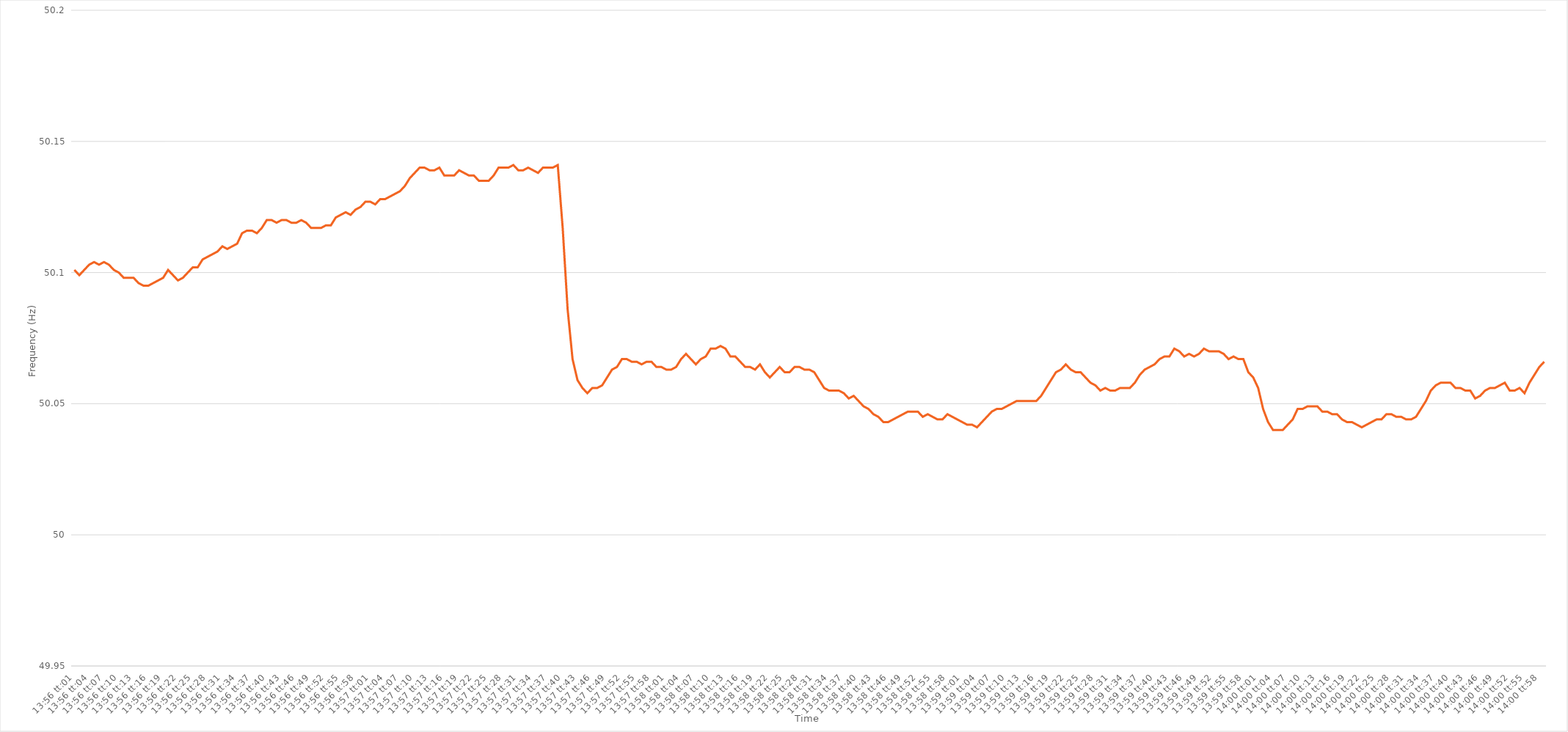
| Category | Series 0 |
|---|---|
| 0.5805671296296296 | 50.101 |
| 0.5805787037037037 | 50.099 |
| 0.5805902777777777 | 50.101 |
| 0.5806018518518519 | 50.103 |
| 0.5806134259259259 | 50.104 |
| 0.5806250000000001 | 50.103 |
| 0.5806365740740741 | 50.104 |
| 0.5806481481481481 | 50.103 |
| 0.5806597222222222 | 50.101 |
| 0.5806712962962963 | 50.1 |
| 0.5806828703703704 | 50.098 |
| 0.5806944444444445 | 50.098 |
| 0.5807060185185186 | 50.098 |
| 0.5807175925925926 | 50.096 |
| 0.5807291666666666 | 50.095 |
| 0.5807407407407407 | 50.095 |
| 0.5807523148148148 | 50.096 |
| 0.5807638888888889 | 50.097 |
| 0.580775462962963 | 50.098 |
| 0.580787037037037 | 50.101 |
| 0.5807986111111111 | 50.099 |
| 0.5808101851851851 | 50.097 |
| 0.5808217592592593 | 50.098 |
| 0.5808333333333333 | 50.1 |
| 0.5808449074074075 | 50.102 |
| 0.5808564814814815 | 50.102 |
| 0.5808680555555555 | 50.105 |
| 0.5808796296296296 | 50.106 |
| 0.5808912037037037 | 50.107 |
| 0.5809027777777778 | 50.108 |
| 0.5809143518518519 | 50.11 |
| 0.580925925925926 | 50.109 |
| 0.5809375 | 50.11 |
| 0.580949074074074 | 50.111 |
| 0.5809606481481482 | 50.115 |
| 0.5809722222222222 | 50.116 |
| 0.5809837962962963 | 50.116 |
| 0.5809953703703704 | 50.115 |
| 0.5810069444444445 | 50.117 |
| 0.5810185185185185 | 50.12 |
| 0.5810300925925925 | 50.12 |
| 0.5810416666666667 | 50.119 |
| 0.5810532407407407 | 50.12 |
| 0.5810648148148149 | 50.12 |
| 0.5810763888888889 | 50.119 |
| 0.581087962962963 | 50.119 |
| 0.581099537037037 | 50.12 |
| 0.5811111111111111 | 50.119 |
| 0.5811226851851852 | 50.117 |
| 0.5811342592592593 | 50.117 |
| 0.5811458333333334 | 50.117 |
| 0.5811574074074074 | 50.118 |
| 0.5811689814814814 | 50.118 |
| 0.5811805555555556 | 50.121 |
| 0.5811921296296296 | 50.122 |
| 0.5812037037037037 | 50.123 |
| 0.5812152777777778 | 50.122 |
| 0.5812268518518519 | 50.124 |
| 0.5812384259259259 | 50.125 |
| 0.5812499999999999 | 50.127 |
| 0.5812615740740741 | 50.127 |
| 0.5812731481481481 | 50.126 |
| 0.5812847222222223 | 50.128 |
| 0.5812962962962963 | 50.128 |
| 0.5813078703703703 | 50.129 |
| 0.5813194444444444 | 50.13 |
| 0.5813310185185185 | 50.131 |
| 0.5813425925925926 | 50.133 |
| 0.5813541666666667 | 50.136 |
| 0.5813657407407408 | 50.138 |
| 0.5813773148148148 | 50.14 |
| 0.5813888888888888 | 50.14 |
| 0.581400462962963 | 50.139 |
| 0.581412037037037 | 50.139 |
| 0.5814236111111112 | 50.14 |
| 0.5814351851851852 | 50.137 |
| 0.5814467592592593 | 50.137 |
| 0.5814583333333333 | 50.137 |
| 0.5814699074074073 | 50.139 |
| 0.5814814814814815 | 50.138 |
| 0.5814930555555555 | 50.137 |
| 0.5815046296296297 | 50.137 |
| 0.5815162037037037 | 50.135 |
| 0.5815277777777778 | 50.135 |
| 0.5815393518518518 | 50.135 |
| 0.5815509259259259 | 50.137 |
| 0.5815625 | 50.14 |
| 0.5815740740740741 | 50.14 |
| 0.5815856481481482 | 50.14 |
| 0.5815972222222222 | 50.141 |
| 0.5816087962962962 | 50.139 |
| 0.5816203703703704 | 50.139 |
| 0.5816319444444444 | 50.14 |
| 0.5816435185185186 | 50.139 |
| 0.5816550925925926 | 50.138 |
| 0.5816666666666667 | 50.14 |
| 0.5816782407407407 | 50.14 |
| 0.5816898148148147 | 50.14 |
| 0.5817013888888889 | 50.141 |
| 0.5817129629629629 | 50.117 |
| 0.5817245370370371 | 50.086 |
| 0.5817361111111111 | 50.067 |
| 0.5817476851851852 | 50.059 |
| 0.5817592592592592 | 50.056 |
| 0.5817708333333333 | 50.054 |
| 0.5817824074074074 | 50.056 |
| 0.5817939814814815 | 50.056 |
| 0.5818055555555556 | 50.057 |
| 0.5818171296296296 | 50.06 |
| 0.5818287037037037 | 50.063 |
| 0.5818402777777778 | 50.064 |
| 0.5818518518518518 | 50.067 |
| 0.581863425925926 | 50.067 |
| 0.581875 | 50.066 |
| 0.5818865740740741 | 50.066 |
| 0.5818981481481481 | 50.065 |
| 0.5819097222222223 | 50.066 |
| 0.5819212962962963 | 50.066 |
| 0.5819328703703703 | 50.064 |
| 0.5819444444444445 | 50.064 |
| 0.5819560185185185 | 50.063 |
| 0.5819675925925926 | 50.063 |
| 0.5819791666666666 | 50.064 |
| 0.5819907407407408 | 50.067 |
| 0.5820023148148148 | 50.069 |
| 0.5820138888888889 | 50.067 |
| 0.582025462962963 | 50.065 |
| 0.582037037037037 | 50.067 |
| 0.5820486111111111 | 50.068 |
| 0.5820601851851852 | 50.071 |
| 0.5820717592592592 | 50.071 |
| 0.5820833333333334 | 50.072 |
| 0.5820949074074074 | 50.071 |
| 0.5821064814814815 | 50.068 |
| 0.5821180555555555 | 50.068 |
| 0.5821296296296297 | 50.066 |
| 0.5821412037037037 | 50.064 |
| 0.5821527777777777 | 50.064 |
| 0.5821643518518519 | 50.063 |
| 0.5821759259259259 | 50.065 |
| 0.5821875 | 50.062 |
| 0.582199074074074 | 50.06 |
| 0.5822106481481482 | 50.062 |
| 0.5822222222222222 | 50.064 |
| 0.5822337962962963 | 50.062 |
| 0.5822453703703704 | 50.062 |
| 0.5822569444444444 | 50.064 |
| 0.5822685185185185 | 50.064 |
| 0.5822800925925926 | 50.063 |
| 0.5822916666666667 | 50.063 |
| 0.5823032407407408 | 50.062 |
| 0.5823148148148148 | 50.059 |
| 0.5823263888888889 | 50.056 |
| 0.5823379629629629 | 50.055 |
| 0.5823495370370371 | 50.055 |
| 0.5823611111111111 | 50.055 |
| 0.5823726851851853 | 50.054 |
| 0.5823842592592593 | 50.052 |
| 0.5823958333333333 | 50.053 |
| 0.5824074074074074 | 50.051 |
| 0.5824189814814814 | 50.049 |
| 0.5824305555555556 | 50.048 |
| 0.5824421296296296 | 50.046 |
| 0.5824537037037038 | 50.045 |
| 0.5824652777777778 | 50.043 |
| 0.5824768518518518 | 50.043 |
| 0.5824884259259259 | 50.044 |
| 0.5825 | 50.045 |
| 0.5825115740740741 | 50.046 |
| 0.5825231481481482 | 50.047 |
| 0.5825347222222222 | 50.047 |
| 0.5825462962962963 | 50.047 |
| 0.5825578703703703 | 50.045 |
| 0.5825694444444445 | 50.046 |
| 0.5825810185185185 | 50.045 |
| 0.5825925925925927 | 50.044 |
| 0.5826041666666667 | 50.044 |
| 0.5826157407407407 | 50.046 |
| 0.5826273148148148 | 50.045 |
| 0.5826388888888888 | 50.044 |
| 0.582650462962963 | 50.043 |
| 0.582662037037037 | 50.042 |
| 0.5826736111111112 | 50.042 |
| 0.5826851851851852 | 50.041 |
| 0.5826967592592592 | 50.043 |
| 0.5827083333333333 | 50.045 |
| 0.5827199074074074 | 50.047 |
| 0.5827314814814815 | 50.048 |
| 0.5827430555555556 | 50.048 |
| 0.5827546296296297 | 50.049 |
| 0.5827662037037037 | 50.05 |
| 0.5827777777777777 | 50.051 |
| 0.5827893518518519 | 50.051 |
| 0.5828009259259259 | 50.051 |
| 0.5828125000000001 | 50.051 |
| 0.5828240740740741 | 50.051 |
| 0.5828356481481481 | 50.053 |
| 0.5828472222222222 | 50.056 |
| 0.5828587962962963 | 50.059 |
| 0.5828703703703704 | 50.062 |
| 0.5828819444444444 | 50.063 |
| 0.5828935185185186 | 50.065 |
| 0.5829050925925926 | 50.063 |
| 0.5829166666666666 | 50.062 |
| 0.5829282407407407 | 50.062 |
| 0.5829398148148148 | 50.06 |
| 0.5829513888888889 | 50.058 |
| 0.582962962962963 | 50.057 |
| 0.582974537037037 | 50.055 |
| 0.5829861111111111 | 50.056 |
| 0.5829976851851851 | 50.055 |
| 0.5830092592592593 | 50.055 |
| 0.5830208333333333 | 50.056 |
| 0.5830324074074075 | 50.056 |
| 0.5830439814814815 | 50.056 |
| 0.5830555555555555 | 50.058 |
| 0.5830671296296296 | 50.061 |
| 0.5830787037037037 | 50.063 |
| 0.5830902777777778 | 50.064 |
| 0.5831018518518518 | 50.065 |
| 0.583113425925926 | 50.067 |
| 0.583125 | 50.068 |
| 0.583136574074074 | 50.068 |
| 0.5831481481481481 | 50.071 |
| 0.5831597222222222 | 50.07 |
| 0.5831712962962963 | 50.068 |
| 0.5831828703703704 | 50.069 |
| 0.5831944444444445 | 50.068 |
| 0.5832060185185185 | 50.069 |
| 0.5832175925925925 | 50.071 |
| 0.5832291666666667 | 50.07 |
| 0.5832407407407407 | 50.07 |
| 0.5832523148148149 | 50.07 |
| 0.5832638888888889 | 50.069 |
| 0.583275462962963 | 50.067 |
| 0.583287037037037 | 50.068 |
| 0.5832986111111111 | 50.067 |
| 0.5833101851851852 | 50.067 |
| 0.5833217592592593 | 50.062 |
| 0.5833333333333334 | 50.06 |
| 0.5833449074074074 | 50.056 |
| 0.5833564814814814 | 50.048 |
| 0.5833680555555555 | 50.043 |
| 0.5833796296296296 | 50.04 |
| 0.5833912037037037 | 50.04 |
| 0.5834027777777778 | 50.04 |
| 0.5834143518518519 | 50.042 |
| 0.5834259259259259 | 50.044 |
| 0.5834374999999999 | 50.048 |
| 0.5834490740740741 | 50.048 |
| 0.5834606481481481 | 50.049 |
| 0.5834722222222223 | 50.049 |
| 0.5834837962962963 | 50.049 |
| 0.5834953703703704 | 50.047 |
| 0.5835069444444444 | 50.047 |
| 0.5835185185185185 | 50.046 |
| 0.5835300925925926 | 50.046 |
| 0.5835416666666667 | 50.044 |
| 0.5835532407407408 | 50.043 |
| 0.5835648148148148 | 50.043 |
| 0.5835763888888889 | 50.042 |
| 0.5835879629629629 | 50.041 |
| 0.583599537037037 | 50.042 |
| 0.5836111111111111 | 50.043 |
| 0.5836226851851852 | 50.044 |
| 0.5836342592592593 | 50.044 |
| 0.5836458333333333 | 50.046 |
| 0.5836574074074073 | 50.046 |
| 0.5836689814814815 | 50.045 |
| 0.5836805555555555 | 50.045 |
| 0.5836921296296297 | 50.044 |
| 0.5837037037037037 | 50.044 |
| 0.5837152777777778 | 50.045 |
| 0.5837268518518518 | 50.048 |
| 0.583738425925926 | 50.051 |
| 0.58375 | 50.055 |
| 0.5837615740740741 | 50.057 |
| 0.5837731481481482 | 50.058 |
| 0.5837847222222222 | 50.058 |
| 0.5837962962962963 | 50.058 |
| 0.5838078703703703 | 50.056 |
| 0.5838194444444444 | 50.056 |
| 0.5838310185185185 | 50.055 |
| 0.5838425925925926 | 50.055 |
| 0.5838541666666667 | 50.052 |
| 0.5838657407407407 | 50.053 |
| 0.5838773148148148 | 50.055 |
| 0.5838888888888889 | 50.056 |
| 0.5839004629629629 | 50.056 |
| 0.5839120370370371 | 50.057 |
| 0.5839236111111111 | 50.058 |
| 0.5839351851851852 | 50.055 |
| 0.5839467592592592 | 50.055 |
| 0.5839583333333334 | 50.056 |
| 0.5839699074074074 | 50.054 |
| 0.5839814814814815 | 50.058 |
| 0.5839930555555556 | 50.061 |
| 0.5840046296296296 | 50.064 |
| 0.5840162037037037 | 50.066 |